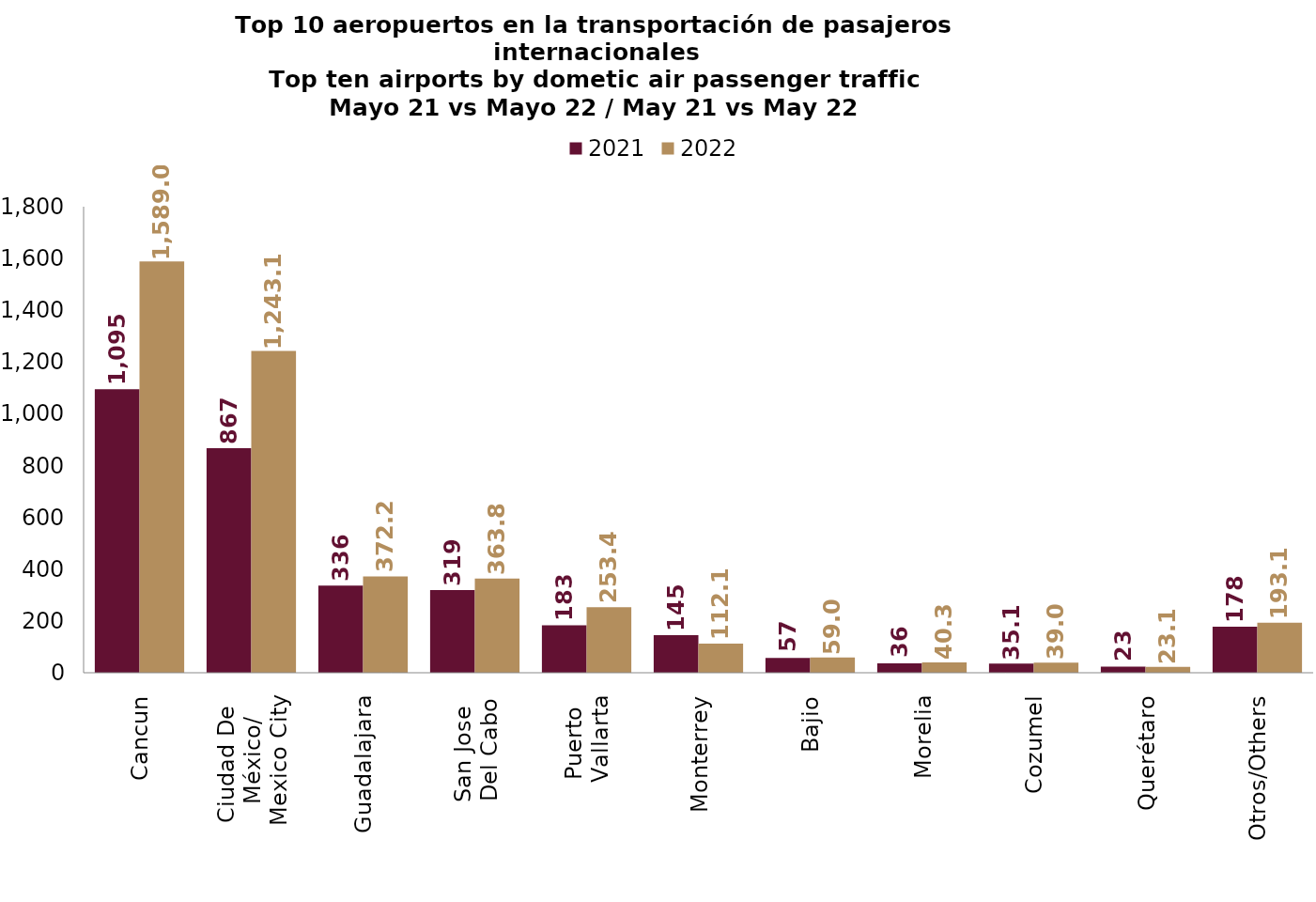
| Category | 2021 | 2022 |
|---|---|---|
| Cancun | 1095.433 | 1589.007 |
| Ciudad De 
México/
Mexico City | 867.347 | 1243.148 |
| Guadalajara | 336.202 | 372.225 |
| San Jose 
Del Cabo | 319.173 | 363.802 |
| Puerto 
Vallarta | 183.435 | 253.447 |
| Monterrey | 145.369 | 112.05 |
| Bajio | 57.463 | 59.002 |
| Morelia | 36.475 | 40.31 |
| Cozumel | 35.147 | 39.031 |
| Querétaro | 23.252 | 23.065 |
| Otros/Others | 177.796 | 193.089 |